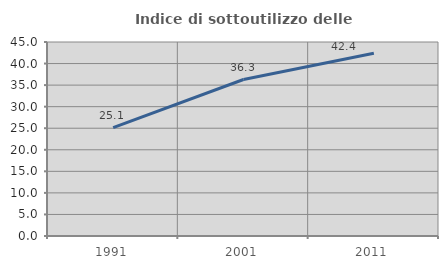
| Category | Indice di sottoutilizzo delle abitazioni  |
|---|---|
| 1991.0 | 25.122 |
| 2001.0 | 36.299 |
| 2011.0 | 42.381 |